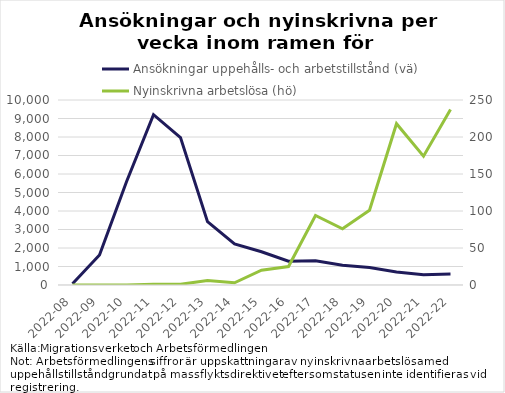
| Category | Ansökningar uppehålls- och arbetstillstånd (vä) |
|---|---|
| 2022-08 | 67 |
| 2022-09 | 1622 |
| 2022-10 | 5585 |
| 2022-11 | 9209 |
| 2022-12 | 7971 |
| 2022-13 | 3425 |
| 2022-14 | 2220 |
| 2022-15 | 1798 |
| 2022-16 | 1286 |
| 2022-17 | 1309 |
| 2022-18 | 1071 |
| 2022-19 | 947 |
| 2022-20 | 707 |
| 2022-21 | 550 |
| 2022-22 | 588 |